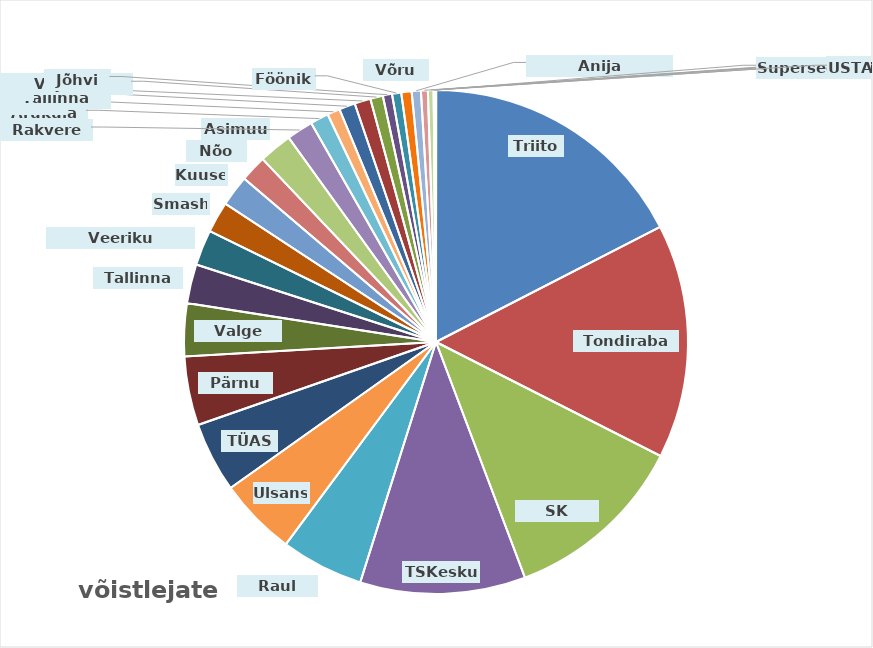
| Category | kokku |
|---|---|
| Triiton | 237 |
| Tondiraba SK | 204 |
| SK Fookus | 160 |
| TSKeskus | 144 |
| Raul Must | 72 |
| Ulsans | 68 |
| TÜASK | 61 |
| Pärnu SK | 60 |
| Valge Hani | 46 |
| Tallinna SK | 34 |
| Veeriku Badminton | 31 |
| Smash | 27 |
| Kuuse | 27 |
| Nõo SK | 23 |
| Asimuut | 29 |
| Rakvere SK | 23 |
| Aruküla SK | 16 |
| TalTech | 11 |
| Tallinna Kalev | 14 |
| Kiili | 14 |
| Viljandi Sulelised | 11 |
| Jõhvi SK | 8 |
| Fööniks | 8 |
| Võru SK | 9 |
| Anija Sulgpalliklubi | 8 |
| Puhja | 6 |
| Harko | 5 |
| Sarv | 0 |
| Viimsi SK | 2 |
| Superseeniorid | 0 |
| USTA | 0 |